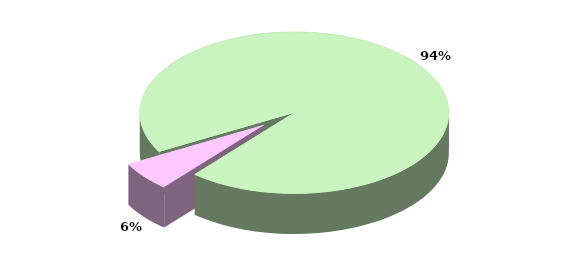
| Category | Series 0 |
|---|---|
| TOTALE ENTRATE CORRENTI | 23683.512 |
| TOTALE ENTRATE IN CONTO CAPITALE | 1458.588 |